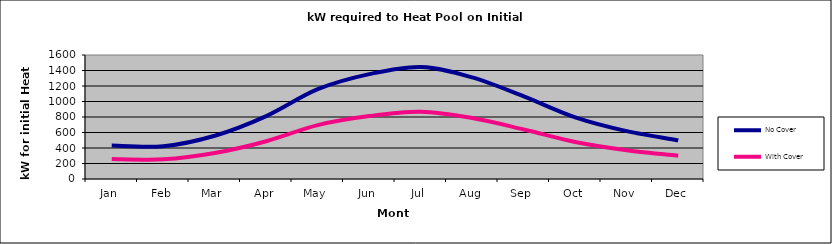
| Category | No Cover | With Cover |
|---|---|---|
| Jan | 431.276 | 258.766 |
| Feb | 422.82 | 253.692 |
| Mar | 558.122 | 334.873 |
| Apr | 811.814 | 487.089 |
| May | 1158.527 | 695.116 |
| Jun | 1353.024 | 811.814 |
| Jul | 1446.044 | 867.627 |
| Aug | 1310.742 | 786.445 |
| Sep | 1065.506 | 639.304 |
| Oct | 794.902 | 476.941 |
| Nov | 617.317 | 370.39 |
| Dec | 498.928 | 299.357 |